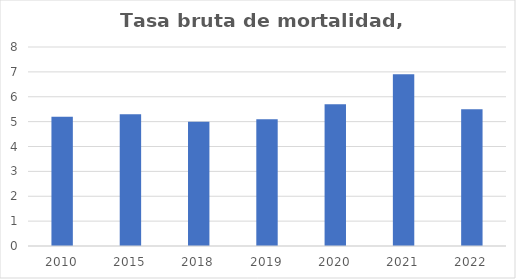
| Category | % |
|---|---|
| 2010.0 | 5.2 |
| 2015.0 | 5.3 |
| 2018.0 | 5 |
| 2019.0 | 5.1 |
| 2020.0 | 5.7 |
| 2021.0 | 6.9 |
| 2022.0 | 5.5 |